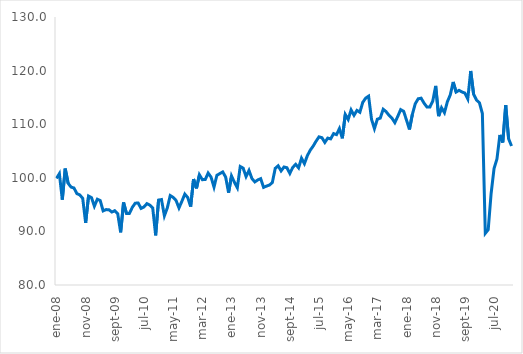
| Category | Desestacionalizada TEC |
|---|---|
| 2008-01-01 | 99.891 |
| 2008-02-01 | 100.771 |
| 2008-03-01 | 95.912 |
| 2008-04-01 | 101.716 |
| 2008-05-01 | 98.978 |
| 2008-06-01 | 98.273 |
| 2008-07-01 | 98.1 |
| 2008-08-01 | 97.048 |
| 2008-09-01 | 96.807 |
| 2008-10-01 | 96.166 |
| 2008-11-01 | 91.59 |
| 2008-12-01 | 96.597 |
| 2009-01-01 | 96.301 |
| 2009-02-01 | 94.702 |
| 2009-03-01 | 96.002 |
| 2009-04-01 | 95.763 |
| 2009-05-01 | 93.826 |
| 2009-06-01 | 94.069 |
| 2009-07-01 | 94.035 |
| 2009-08-01 | 93.614 |
| 2009-09-01 | 93.863 |
| 2009-10-01 | 93.3 |
| 2009-11-01 | 89.831 |
| 2009-12-01 | 95.393 |
| 2010-01-01 | 93.344 |
| 2010-02-01 | 93.346 |
| 2010-03-01 | 94.484 |
| 2010-04-01 | 95.262 |
| 2010-05-01 | 95.302 |
| 2010-06-01 | 94.288 |
| 2010-07-01 | 94.565 |
| 2010-08-01 | 95.174 |
| 2010-09-01 | 94.898 |
| 2010-10-01 | 94.375 |
| 2010-11-01 | 89.26 |
| 2010-12-01 | 95.845 |
| 2011-01-01 | 95.943 |
| 2011-02-01 | 92.913 |
| 2011-03-01 | 94.389 |
| 2011-04-01 | 96.69 |
| 2011-05-01 | 96.353 |
| 2011-06-01 | 95.771 |
| 2011-07-01 | 94.375 |
| 2011-08-01 | 95.625 |
| 2011-09-01 | 96.958 |
| 2011-10-01 | 96.32 |
| 2011-11-01 | 94.624 |
| 2011-12-01 | 99.77 |
| 2012-01-01 | 98.03 |
| 2012-02-01 | 100.557 |
| 2012-03-01 | 99.652 |
| 2012-04-01 | 99.676 |
| 2012-05-01 | 100.884 |
| 2012-06-01 | 100.12 |
| 2012-07-01 | 98.277 |
| 2012-08-01 | 100.469 |
| 2012-09-01 | 100.783 |
| 2012-10-01 | 101.097 |
| 2012-11-01 | 100.139 |
| 2012-12-01 | 97.228 |
| 2013-01-01 | 100.345 |
| 2013-02-01 | 99.161 |
| 2013-03-01 | 98.152 |
| 2013-04-01 | 102.107 |
| 2013-05-01 | 101.805 |
| 2013-06-01 | 100.236 |
| 2013-07-01 | 101.369 |
| 2013-08-01 | 99.865 |
| 2013-09-01 | 99.231 |
| 2013-10-01 | 99.6 |
| 2013-11-01 | 99.837 |
| 2013-12-01 | 98.214 |
| 2014-01-01 | 98.452 |
| 2014-02-01 | 98.64 |
| 2014-03-01 | 99.115 |
| 2014-04-01 | 101.768 |
| 2014-05-01 | 102.238 |
| 2014-06-01 | 101.291 |
| 2014-07-01 | 102.013 |
| 2014-08-01 | 101.878 |
| 2014-09-01 | 100.825 |
| 2014-10-01 | 101.928 |
| 2014-11-01 | 102.518 |
| 2014-12-01 | 101.854 |
| 2015-01-01 | 103.66 |
| 2015-02-01 | 102.635 |
| 2015-03-01 | 104.125 |
| 2015-04-01 | 105.152 |
| 2015-05-01 | 105.918 |
| 2015-06-01 | 106.834 |
| 2015-07-01 | 107.643 |
| 2015-08-01 | 107.482 |
| 2015-09-01 | 106.602 |
| 2015-10-01 | 107.404 |
| 2015-11-01 | 107.262 |
| 2015-12-01 | 108.25 |
| 2016-01-01 | 108.054 |
| 2016-02-01 | 109.186 |
| 2016-03-01 | 107.366 |
| 2016-04-01 | 111.817 |
| 2016-05-01 | 110.884 |
| 2016-06-01 | 112.66 |
| 2016-07-01 | 111.662 |
| 2016-08-01 | 112.578 |
| 2016-09-01 | 112.227 |
| 2016-10-01 | 114.077 |
| 2016-11-01 | 114.864 |
| 2016-12-01 | 115.229 |
| 2017-01-01 | 110.921 |
| 2017-02-01 | 109.171 |
| 2017-03-01 | 110.933 |
| 2017-04-01 | 111.134 |
| 2017-05-01 | 112.791 |
| 2017-06-01 | 112.346 |
| 2017-07-01 | 111.655 |
| 2017-08-01 | 111.13 |
| 2017-09-01 | 110.291 |
| 2017-10-01 | 111.462 |
| 2017-11-01 | 112.72 |
| 2017-12-01 | 112.411 |
| 2018-01-01 | 110.769 |
| 2018-02-01 | 109.019 |
| 2018-03-01 | 111.833 |
| 2018-04-01 | 113.827 |
| 2018-05-01 | 114.744 |
| 2018-06-01 | 114.856 |
| 2018-07-01 | 113.941 |
| 2018-08-01 | 113.205 |
| 2018-09-01 | 113.195 |
| 2018-10-01 | 114.333 |
| 2018-11-01 | 117.133 |
| 2018-12-01 | 111.502 |
| 2019-01-01 | 113.069 |
| 2019-02-01 | 112.152 |
| 2019-03-01 | 114.179 |
| 2019-04-01 | 115.475 |
| 2019-05-01 | 117.874 |
| 2019-06-01 | 115.993 |
| 2019-07-01 | 116.322 |
| 2019-08-01 | 116.014 |
| 2019-09-01 | 115.808 |
| 2019-10-01 | 114.717 |
| 2019-11-01 | 119.93 |
| 2019-12-01 | 115.598 |
| 2020-01-01 | 114.509 |
| 2020-02-01 | 113.999 |
| 2020-03-01 | 111.997 |
| 2020-04-01 | 89.642 |
| 2020-05-01 | 90.32 |
| 2020-06-01 | 97.071 |
| 2020-07-01 | 101.74 |
| 2020-08-01 | 103.504 |
| 2020-09-01 | 107.986 |
| 2020-10-01 | 106.585 |
| 2020-11-01 | 113.546 |
| 2020-12-01 | 107.253 |
| 2021-01-01 | 105.923 |